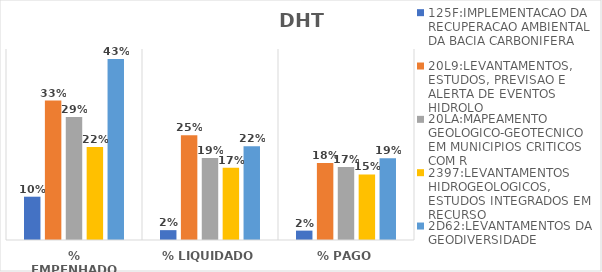
| Category | 125F:IMPLEMENTACAO DA RECUPERACAO AMBIENTAL DA BACIA CARBONIFERA | 20L9:LEVANTAMENTOS, ESTUDOS, PREVISAO E ALERTA DE EVENTOS HIDROLO | 20LA:MAPEAMENTO GEOLOGICO-GEOTECNICO EM MUNICIPIOS CRITICOS COM R | 2397:LEVANTAMENTOS HIDROGEOLOGICOS, ESTUDOS INTEGRADOS EM RECURSO | 2D62:LEVANTAMENTOS DA GEODIVERSIDADE |
|---|---|---|---|---|---|
| % EMPENHADO | 0.102 | 0.329 | 0.29 | 0.219 | 0.427 |
| % LIQUIDADO | 0.023 | 0.247 | 0.193 | 0.17 | 0.221 |
| % PAGO | 0.022 | 0.181 | 0.172 | 0.155 | 0.192 |